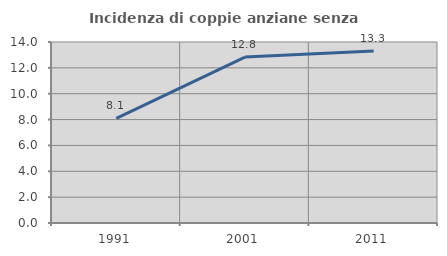
| Category | Incidenza di coppie anziane senza figli  |
|---|---|
| 1991.0 | 8.094 |
| 2001.0 | 12.836 |
| 2011.0 | 13.306 |